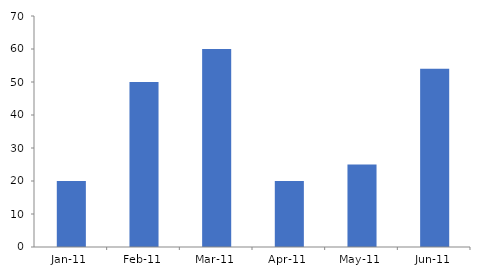
| Category | Series 0 |
|---|---|
| 2011-01-01 | 20 |
| 2011-02-01 | 50 |
| 2011-03-01 | 60 |
| 2011-04-01 | 20 |
| 2011-05-01 | 25 |
| 2011-06-01 | 54 |